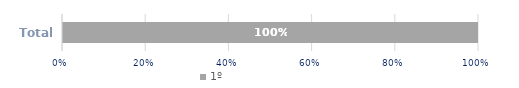
| Category | 1º |
|---|---|
| Total | 1 |